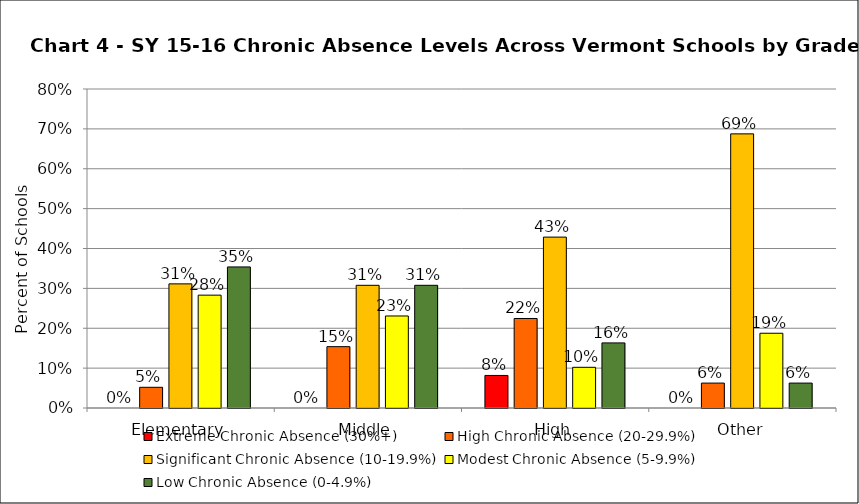
| Category | Extreme Chronic Absence (30%+) | High Chronic Absence (20-29.9%) | Significant Chronic Absence (10-19.9%) | Modest Chronic Absence (5-9.9%) | Low Chronic Absence (0-4.9%) |
|---|---|---|---|---|---|
| 0 | 0 | 0.052 | 0.311 | 0.283 | 0.354 |
| 1 | 0 | 0.154 | 0.308 | 0.231 | 0.308 |
| 2 | 0.082 | 0.224 | 0.429 | 0.102 | 0.163 |
| 3 | 0 | 0.062 | 0.688 | 0.188 | 0.062 |